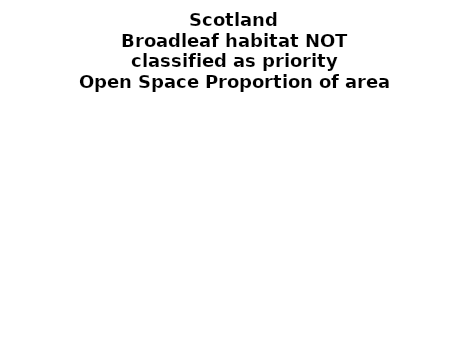
| Category | Broadleaf habitat NOT classified as priority |
|---|---|
|  ≥ 10ha, < 10%  | 0.213 |
|   ≥ 10ha, 10-25% | 0.119 |
|   ≥ 10ha, > 25 and <50%  | 0.162 |
|   ≥ 10ha, ≥ 50%  | 0.171 |
|  < 10ha, < 10% | 0.021 |
|  < 10ha, 10-25% | 0.027 |
|  < 10ha, > 25 and < 50% | 0.078 |
|  < 10ha, ≥ 50% | 0.209 |